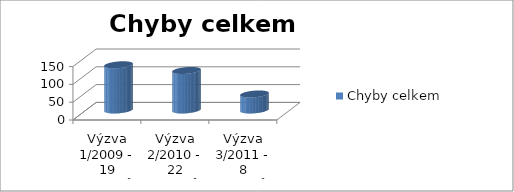
| Category | Chyby celkem                 |
|---|---|
| Výzva 1/2009 - 19 projektů | 127 |
| Výzva 2/2010 - 22 projektů  | 111 |
| Výzva 3/2011 - 8 projektů  | 45 |